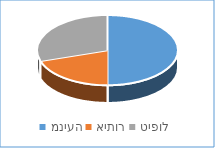
| Category | Series 0 |
|---|---|
| מניעה | 5 |
| איתור | 2 |
| טיפול | 3 |